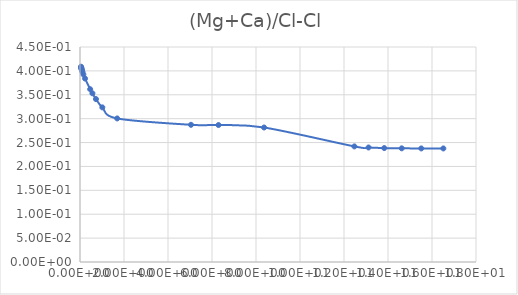
| Category | (Mg+Ca)/Cl |
|---|---|
| 0.045801 | 0.409 |
| 0.050889 | 0.408 |
| 0.057263 | 0.406 |
| 0.065462 | 0.405 |
| 0.076377 | 0.403 |
| 0.091694 | 0.401 |
| 0.11465 | 0.397 |
| 0.15301 | 0.393 |
| 0.22977 | 0.384 |
| 0.46188 | 0.362 |
| 0.56443 | 0.353 |
| 0.7255 | 0.341 |
| 1.0152 | 0.324 |
| 1.6902 | 0.3 |
| 5.0451 | 0.287 |
| 6.2946 | 0.287 |
| 8.3668 | 0.282 |
| 12.472 | 0.242 |
| 13.115 | 0.24 |
| 13.828 | 0.238 |
| 14.623 | 0.238 |
| 15.513 | 0.238 |
| 16.516 | 0.238 |